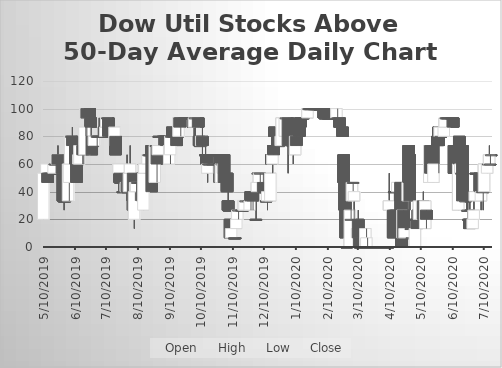
| Category | Open | High | Low | Close |
|---|---|---|---|---|
| 5/10/19 | 20 | 53.33 | 20 | 53.33 |
| 5/13/19 | 53.33 | 60 | 53.33 | 60 |
| 5/14/19 | 53.33 | 53.33 | 46.66 | 46.66 |
| 5/15/19 | 53.33 | 53.33 | 46.66 | 53.33 |
| 5/16/19 | 53.33 | 53.33 | 53.33 | 53.33 |
| 5/17/19 | 53.33 | 53.33 | 53.33 | 53.33 |
| 5/20/19 | 53.33 | 60 | 53.33 | 60 |
| 5/21/19 | 60 | 60 | 60 | 60 |
| 5/22/19 | 60 | 60 | 60 | 60 |
| 5/23/19 | 60 | 66.66 | 60 | 66.66 |
| 5/24/19 | 66.66 | 73.33 | 60 | 60 |
| 5/28/19 | 60 | 60 | 53.33 | 53.33 |
| 5/29/19 | 53.33 | 53.33 | 33.33 | 33.33 |
| 5/30/19 | 33.33 | 33.33 | 26.66 | 33.33 |
| 5/31/19 | 33.33 | 33.33 | 33.33 | 33.33 |
| 6/3/19 | 33.33 | 60 | 33.33 | 60 |
| 6/4/19 | 46.66 | 60 | 33.33 | 60 |
| 6/5/19 | 60 | 80 | 60 | 80 |
| 6/6/19 | 80 | 80 | 80 | 80 |
| 6/7/19 | 80 | 86.66 | 73.33 | 73.33 |
| 6/10/19 | 73.33 | 73.33 | 53.33 | 60 |
| 6/11/19 | 60 | 60 | 46.66 | 46.66 |
| 6/12/19 | 60 | 60 | 60 | 60 |
| 6/13/19 | 60 | 66.66 | 60 | 66.66 |
| 6/14/19 | 60 | 73.33 | 60 | 73.33 |
| 6/17/19 | 73.33 | 80 | 60 | 66.66 |
| 6/18/19 | 73.33 | 80 | 60 | 66.66 |
| 6/19/19 | 66.66 | 86.66 | 66.66 | 86.66 |
| 6/20/19 | 93.33 | 100 | 80 | 100 |
| 6/21/19 | 100 | 100 | 80 | 93.33 |
| 6/24/19 | 100 | 100 | 86.66 | 93.33 |
| 6/25/19 | 93.33 | 93.33 | 80 | 86.66 |
| 6/26/19 | 80 | 80 | 66.66 | 66.66 |
| 6/27/19 | 73.33 | 73.33 | 66.66 | 73.33 |
| 6/28/19 | 73.33 | 80 | 73.33 | 80 |
| 7/1/19 | 80 | 80 | 66.66 | 80 |
| 7/2/19 | 80 | 80 | 80 | 80 |
| 7/3/19 | 80 | 93.33 | 80 | 80 |
| 7/5/19 | 80 | 80 | 80 | 80 |
| 7/8/19 | 86.66 | 86.66 | 80 | 80 |
| 7/9/19 | 80 | 86.66 | 80 | 86.66 |
| 7/10/19 | 86.66 | 93.33 | 86.66 | 93.33 |
| 7/11/19 | 93.33 | 93.33 | 80 | 93.33 |
| 7/12/19 | 93.33 | 93.33 | 80 | 80 |
| 7/15/19 | 80 | 80 | 80 | 80 |
| 7/16/19 | 80 | 80 | 66.66 | 80 |
| 7/17/19 | 80 | 80 | 80 | 80 |
| 7/18/19 | 73.33 | 86.66 | 73.33 | 86.66 |
| 7/19/19 | 80 | 80 | 66.66 | 66.66 |
| 7/22/19 | 53.33 | 60 | 40 | 60 |
| 7/23/19 | 53.33 | 53.33 | 46.66 | 46.66 |
| 7/24/19 | 46.66 | 46.66 | 40 | 46.66 |
| 7/25/19 | 46.66 | 46.66 | 40 | 46.66 |
| 7/26/19 | 40 | 53.33 | 40 | 40 |
| 7/29/19 | 40 | 46.66 | 40 | 46.66 |
| 7/30/19 | 46.66 | 66.66 | 33.33 | 40 |
| 7/31/19 | 40 | 53.33 | 40 | 40 |
| 8/1/19 | 40 | 53.33 | 40 | 53.33 |
| 8/2/19 | 53.33 | 73.33 | 46.66 | 60 |
| 8/5/19 | 53.33 | 53.33 | 20 | 26.66 |
| 8/6/19 | 20 | 46.66 | 13.33 | 40 |
| 8/7/19 | 40 | 46.66 | 33.33 | 46.66 |
| 8/8/19 | 40 | 46.66 | 40 | 46.66 |
| 8/9/19 | 46.66 | 53.33 | 46.66 | 46.66 |
| 8/12/19 | 46.66 | 46.66 | 46.66 | 46.66 |
| 8/13/19 | 46.66 | 46.66 | 46.66 | 46.66 |
| 8/14/19 | 46.66 | 46.66 | 33.33 | 33.33 |
| 8/15/19 | 26.66 | 60 | 26.66 | 53.33 |
| 8/16/19 | 53.33 | 60 | 53.33 | 60 |
| 8/19/19 | 60 | 66.66 | 60 | 66.66 |
| 8/20/19 | 66.66 | 66.66 | 60 | 66.66 |
| 8/21/19 | 66.66 | 66.66 | 66.66 | 66.66 |
| 8/22/19 | 66.66 | 66.66 | 60 | 66.66 |
| 8/23/19 | 73.33 | 73.33 | 40 | 40 |
| 8/26/19 | 46.66 | 73.33 | 46.66 | 73.33 |
| 8/27/19 | 73.33 | 73.33 | 73.33 | 73.33 |
| 8/28/19 | 73.33 | 73.33 | 46.66 | 60 |
| 8/29/19 | 66.66 | 73.33 | 60 | 73.33 |
| 8/30/19 | 80 | 80 | 73.33 | 80 |
| 9/3/19 | 80 | 80 | 80 | 80 |
| 9/4/19 | 80 | 80 | 80 | 80 |
| 9/5/19 | 80 | 80 | 80 | 80 |
| 9/6/19 | 80 | 80 | 60 | 73.33 |
| 9/9/19 | 60 | 73.33 | 60 | 73.33 |
| 9/10/19 | 66.66 | 80 | 60 | 80 |
| 9/11/19 | 80 | 80 | 73.33 | 80 |
| 9/12/19 | 86.66 | 86.66 | 80 | 80 |
| 9/13/19 | 80 | 86.66 | 73.33 | 80 |
| 9/16/19 | 80 | 86.66 | 73.33 | 73.33 |
| 9/17/19 | 80 | 93.33 | 80 | 80 |
| 9/18/19 | 80 | 93.33 | 80 | 93.33 |
| 9/19/19 | 93.33 | 93.33 | 86.66 | 86.66 |
| 9/20/19 | 93.33 | 93.33 | 80 | 93.33 |
| 9/23/19 | 93.33 | 93.33 | 93.33 | 93.33 |
| 9/24/19 | 93.33 | 93.33 | 93.33 | 93.33 |
| 9/25/19 | 93.33 | 93.33 | 93.33 | 93.33 |
| 9/26/19 | 93.33 | 93.33 | 93.33 | 93.33 |
| 9/27/19 | 93.33 | 93.33 | 93.33 | 93.33 |
| 9/30/19 | 93.33 | 93.33 | 93.33 | 93.33 |
| 10/1/19 | 93.33 | 93.33 | 93.33 | 93.33 |
| 10/2/19 | 93.33 | 93.33 | 86.66 | 86.66 |
| 10/3/19 | 86.66 | 93.33 | 73.33 | 93.33 |
| 10/4/19 | 93.33 | 93.33 | 73.33 | 93.33 |
| 10/7/19 | 93.33 | 93.33 | 86.66 | 86.66 |
| 10/8/19 | 80 | 80 | 73.33 | 73.33 |
| 10/9/19 | 73.33 | 73.33 | 73.33 | 73.33 |
| 10/10/19 | 73.33 | 80 | 73.33 | 80 |
| 10/11/19 | 80 | 86.66 | 66.66 | 73.33 |
| 10/14/19 | 66.66 | 73.33 | 60 | 66.66 |
| 10/15/19 | 66.66 | 66.66 | 53.33 | 60 |
| 10/16/19 | 53.33 | 60 | 46.66 | 60 |
| 10/17/19 | 60 | 66.66 | 60 | 60 |
| 10/18/19 | 60 | 66.66 | 60 | 60 |
| 10/21/19 | 60 | 60 | 60 | 60 |
| 10/22/19 | 66.66 | 66.66 | 66.66 | 66.66 |
| 10/23/19 | 66.66 | 66.66 | 66.66 | 66.66 |
| 10/24/19 | 66.66 | 66.66 | 66.66 | 66.66 |
| 10/25/19 | 66.66 | 66.66 | 66.66 | 66.66 |
| 10/28/19 | 66.66 | 66.66 | 46.66 | 46.66 |
| 10/29/19 | 46.66 | 60 | 46.66 | 60 |
| 10/30/19 | 60 | 60 | 46.66 | 60 |
| 10/31/19 | 53.33 | 60 | 46.66 | 60 |
| 11/1/19 | 66.66 | 66.66 | 46.66 | 46.66 |
| 11/4/19 | 53.33 | 53.33 | 40 | 40 |
| 11/5/19 | 33.33 | 40 | 26.66 | 26.66 |
| 11/6/19 | 26.66 | 26.66 | 26.66 | 26.66 |
| 11/7/19 | 20 | 20 | 6.66 | 6.66 |
| 11/8/19 | 6.66 | 20 | 6.66 | 13.33 |
| 11/11/19 | 6.66 | 6.66 | 6.66 | 6.66 |
| 11/12/19 | 6.66 | 6.66 | 6.66 | 6.66 |
| 11/13/19 | 13.33 | 20 | 13.33 | 20 |
| 11/14/19 | 20 | 26.66 | 20 | 26.66 |
| 11/15/19 | 26.66 | 26.66 | 20 | 26.66 |
| 11/18/19 | 26.66 | 26.66 | 26.66 | 26.66 |
| 11/19/19 | 26.66 | 26.66 | 26.66 | 26.66 |
| 11/20/19 | 26.66 | 33.33 | 26.66 | 33.33 |
| 11/21/19 | 26.66 | 33.33 | 26.66 | 33.33 |
| 11/22/19 | 33.33 | 33.33 | 33.33 | 33.33 |
| 11/25/19 | 33.33 | 33.33 | 26.66 | 33.33 |
| 11/26/19 | 26.66 | 33.33 | 26.66 | 33.33 |
| 11/27/19 | 40 | 40 | 26.66 | 33.33 |
| 11/29/19 | 40 | 40 | 26.66 | 33.33 |
| 12/2/19 | 20 | 33.33 | 20 | 20 |
| 12/3/19 | 40 | 53.33 | 40 | 46.66 |
| 12/4/19 | 53.33 | 53.33 | 46.66 | 53.33 |
| 12/5/19 | 46.66 | 53.33 | 46.66 | 53.33 |
| 12/6/19 | 53.33 | 53.33 | 46.66 | 53.33 |
| 12/9/19 | 46.66 | 53.33 | 33.33 | 40 |
| 12/10/19 | 40 | 40 | 40 | 40 |
| 12/11/19 | 40 | 40 | 33.33 | 40 |
| 12/12/19 | 33.33 | 40 | 33.33 | 33.33 |
| 12/13/19 | 33.33 | 40 | 26.66 | 40 |
| 12/16/19 | 33.33 | 53.33 | 33.33 | 53.33 |
| 12/17/19 | 66.66 | 73.33 | 60 | 60 |
| 12/18/19 | 60 | 73.33 | 53.33 | 66.66 |
| 12/19/19 | 73.33 | 73.33 | 66.66 | 66.66 |
| 12/20/19 | 86.66 | 86.66 | 73.33 | 80 |
| 12/23/19 | 80 | 80 | 66.66 | 73.33 |
| 12/24/19 | 73.33 | 73.33 | 73.33 | 73.33 |
| 12/26/19 | 73.33 | 80 | 73.33 | 80 |
| 12/27/19 | 73.33 | 93.33 | 73.33 | 93.33 |
| 12/30/19 | 80 | 93.33 | 73.33 | 93.33 |
| 12/31/19 | 93.33 | 93.33 | 93.33 | 93.33 |
| 1/2/20 | 93.33 | 93.33 | 53.33 | 73.33 |
| 1/3/20 | 86.66 | 86.66 | 80 | 80 |
| 1/6/20 | 80 | 86.66 | 80 | 80 |
| 1/7/20 | 73.33 | 80 | 60 | 73.33 |
| 1/8/20 | 73.33 | 86.66 | 66.66 | 73.33 |
| 1/9/20 | 66.66 | 80 | 66.66 | 80 |
| 1/10/20 | 80 | 80 | 73.33 | 73.33 |
| 1/13/20 | 86.66 | 86.66 | 80 | 80 |
| 1/14/20 | 93.33 | 93.33 | 73.33 | 86.66 |
| 1/15/20 | 93.33 | 93.33 | 93.33 | 93.33 |
| 1/16/20 | 93.33 | 93.33 | 93.33 | 93.33 |
| 1/17/20 | 93.33 | 93.33 | 93.33 | 93.33 |
| 1/21/20 | 93.33 | 100 | 93.33 | 100 |
| 1/22/20 | 100 | 100 | 100 | 100 |
| 1/23/20 | 100 | 100 | 100 | 100 |
| 1/24/20 | 100 | 100 | 100 | 100 |
| 1/27/20 | 100 | 100 | 100 | 100 |
| 1/28/20 | 100 | 100 | 100 | 100 |
| 1/29/20 | 100 | 100 | 100 | 100 |
| 1/30/20 | 100 | 100 | 100 | 100 |
| 1/31/20 | 100 | 100 | 93.33 | 100 |
| 2/3/20 | 100 | 100 | 100 | 100 |
| 2/4/20 | 100 | 100 | 93.33 | 100 |
| 2/5/20 | 100 | 100 | 100 | 100 |
| 2/6/20 | 100 | 100 | 93.33 | 93.33 |
| 2/7/20 | 93.33 | 93.33 | 93.33 | 93.33 |
| 2/10/20 | 93.33 | 93.33 | 93.33 | 93.33 |
| 2/11/20 | 93.33 | 93.33 | 93.33 | 93.33 |
| 2/12/20 | 93.33 | 93.33 | 93.33 | 93.33 |
| 2/13/20 | 93.33 | 93.33 | 93.33 | 93.33 |
| 2/14/20 | 93.33 | 93.33 | 93.33 | 93.33 |
| 2/18/20 | 93.33 | 100 | 93.33 | 100 |
| 2/19/20 | 93.33 | 100 | 86.66 | 93.33 |
| 2/20/20 | 93.33 | 93.33 | 93.33 | 93.33 |
| 2/21/20 | 93.33 | 93.33 | 86.66 | 86.66 |
| 2/24/20 | 86.66 | 86.66 | 80 | 80 |
| 2/25/20 | 66.66 | 66.66 | 40 | 46.66 |
| 2/26/20 | 46.66 | 53.33 | 26.66 | 26.66 |
| 2/27/20 | 26.66 | 33.33 | 6.66 | 6.66 |
| 2/28/20 | 0.01 | 0.01 | 0.01 | 0.01 |
| 3/2/20 | 0.01 | 26.66 | 0.01 | 26.66 |
| 3/3/20 | 20 | 33.33 | 20 | 20 |
| 3/4/20 | 33.33 | 46.66 | 33.33 | 46.66 |
| 3/5/20 | 46.66 | 46.66 | 40 | 46.66 |
| 3/6/20 | 33.33 | 40 | 20 | 40 |
| 3/9/20 | 6.66 | 20 | 6.66 | 13.33 |
| 3/10/20 | 20 | 26.66 | 6.66 | 6.66 |
| 3/11/20 | 6.66 | 6.66 | 0.01 | 0.01 |
| 3/12/20 | 0.01 | 0.01 | 0.01 | 0.01 |
| 3/13/20 | 0.01 | 0.01 | 0.01 | 0.01 |
| 3/16/20 | 0.01 | 6.66 | 0.01 | 0.01 |
| 3/17/20 | 0.01 | 13.33 | 0.01 | 13.33 |
| 3/18/20 | 0.01 | 13.33 | 0.01 | 6.66 |
| 3/19/20 | 0.01 | 6.66 | 0.01 | 0.01 |
| 3/20/20 | 0.01 | 0.01 | 0.01 | 0.01 |
| 3/23/20 | 0.01 | 0.01 | 0.01 | 0.01 |
| 3/24/20 | 0.01 | 0.01 | 0.01 | 0.01 |
| 3/25/20 | 0.01 | 0.01 | 0.01 | 0.01 |
| 3/26/20 | 0.01 | 0.01 | 0.01 | 0.01 |
| 3/27/20 | 0.01 | 0.01 | 0.01 | 0.01 |
| 3/30/20 | 0.01 | 0.01 | 0.01 | 0.01 |
| 3/31/20 | 0.01 | 0.01 | 0.01 | 0.01 |
| 4/1/20 | 0.01 | 0.01 | 0.01 | 0.01 |
| 4/2/20 | 0.01 | 0.01 | 0.01 | 0.01 |
| 4/3/20 | 0.01 | 0.01 | 0.01 | 0.01 |
| 4/6/20 | 0.01 | 0.01 | 0.01 | 0.01 |
| 4/7/20 | 0.01 | 0.01 | 0.01 | 0.01 |
| 4/8/20 | 0.01 | 0.01 | 0.01 | 0.01 |
| 4/9/20 | 26.66 | 53.33 | 26.66 | 33.33 |
| 4/13/20 | 26.66 | 26.66 | 6.66 | 6.66 |
| 4/14/20 | 40 | 40 | 33.33 | 40 |
| 4/15/20 | 26.66 | 26.66 | 20 | 26.66 |
| 4/16/20 | 26.66 | 26.66 | 20 | 26.66 |
| 4/17/20 | 40 | 46.66 | 26.66 | 46.66 |
| 4/20/20 | 46.66 | 46.66 | 20 | 20 |
| 4/21/20 | 6.66 | 6.66 | 0.01 | 0.01 |
| 4/22/20 | 6.66 | 33.33 | 6.66 | 26.66 |
| 4/23/20 | 26.66 | 26.66 | 6.66 | 6.66 |
| 4/24/20 | 6.66 | 13.33 | 6.66 | 13.33 |
| 4/27/20 | 33.33 | 53.33 | 20 | 46.66 |
| 4/28/20 | 73.33 | 73.33 | 40 | 46.66 |
| 4/29/20 | 66.66 | 66.66 | 26.66 | 33.33 |
| 4/30/20 | 13.33 | 13.33 | 13.33 | 13.33 |
| 5/1/20 | 6.66 | 6.66 | 6.66 | 6.66 |
| 5/4/20 | 0.01 | 13.33 | 0.01 | 13.33 |
| 5/5/20 | 20 | 26.66 | 20 | 20 |
| 5/6/20 | 20 | 20 | 13.33 | 13.33 |
| 5/7/20 | 26.66 | 26.66 | 20 | 20 |
| 5/8/20 | 20 | 33.33 | 20 | 33.33 |
| 5/11/20 | 20 | 33.33 | 20 | 33.33 |
| 5/12/20 | 33.33 | 40 | 20 | 20 |
| 5/13/20 | 26.66 | 26.66 | 20 | 20 |
| 5/14/20 | 13.33 | 33.33 | 13.33 | 33.33 |
| 5/15/20 | 26.66 | 26.66 | 13.33 | 20 |
| 5/18/20 | 46.66 | 73.33 | 46.66 | 73.33 |
| 5/19/20 | 73.33 | 73.33 | 53.33 | 53.33 |
| 5/20/20 | 66.66 | 80 | 66.66 | 66.66 |
| 5/21/20 | 73.33 | 80 | 46.66 | 53.33 |
| 5/22/20 | 46.66 | 66.66 | 46.66 | 60 |
| 5/26/20 | 80 | 86.66 | 73.33 | 73.33 |
| 5/27/20 | 86.66 | 86.66 | 53.33 | 73.33 |
| 5/28/20 | 80 | 86.66 | 80 | 86.66 |
| 5/29/20 | 80 | 80 | 80 | 80 |
| 6/1/20 | 80 | 86.66 | 80 | 86.66 |
| 6/2/20 | 86.66 | 93.33 | 86.66 | 93.33 |
| 6/3/20 | 93.33 | 93.33 | 93.33 | 93.33 |
| 6/4/20 | 93.33 | 93.33 | 86.66 | 93.33 |
| 6/5/20 | 93.33 | 93.33 | 93.33 | 93.33 |
| 6/8/20 | 93.33 | 93.33 | 93.33 | 93.33 |
| 6/9/20 | 93.33 | 93.33 | 93.33 | 93.33 |
| 6/10/20 | 93.33 | 93.33 | 86.66 | 86.66 |
| 6/11/20 | 73.33 | 73.33 | 40 | 53.33 |
| 6/12/20 | 73.33 | 73.33 | 40 | 53.33 |
| 6/15/20 | 26.66 | 60 | 26.66 | 60 |
| 6/16/20 | 80 | 80 | 60 | 60 |
| 6/17/20 | 53.33 | 80 | 46.66 | 60 |
| 6/18/20 | 53.33 | 53.33 | 40 | 53.33 |
| 6/19/20 | 73.33 | 73.33 | 33.33 | 33.33 |
| 6/22/20 | 33.33 | 40 | 33.33 | 33.33 |
| 6/23/20 | 40 | 40 | 26.66 | 33.33 |
| 6/24/20 | 26.66 | 33.33 | 20 | 26.66 |
| 6/25/20 | 20 | 20 | 13.33 | 20 |
| 6/26/20 | 20 | 33.33 | 13.33 | 13.33 |
| 6/29/20 | 13.33 | 20 | 13.33 | 20 |
| 6/30/20 | 20 | 33.33 | 20 | 26.66 |
| 7/1/20 | 33.33 | 46.66 | 33.33 | 40 |
| 7/2/20 | 53.33 | 53.33 | 46.66 | 53.33 |
| 7/6/20 | 53.33 | 53.33 | 33.33 | 40 |
| 7/7/20 | 33.33 | 40 | 26.66 | 40 |
| 7/8/20 | 40 | 46.66 | 40 | 40 |
| 7/9/20 | 40 | 40 | 26.66 | 40 |
| 7/10/20 | 40 | 60 | 40 | 60 |
| 7/13/20 | 53.33 | 60 | 53.33 | 60 |
| 7/14/20 | 60 | 66.66 | 60 | 60 |
| 7/15/20 | 60 | 73.33 | 60 | 66.66 |
| 7/16/20 | 60 | 66.66 | 60 | 60 |
| 7/17/20 | 66.66 | 66.66 | 66.66 | 66.66 |